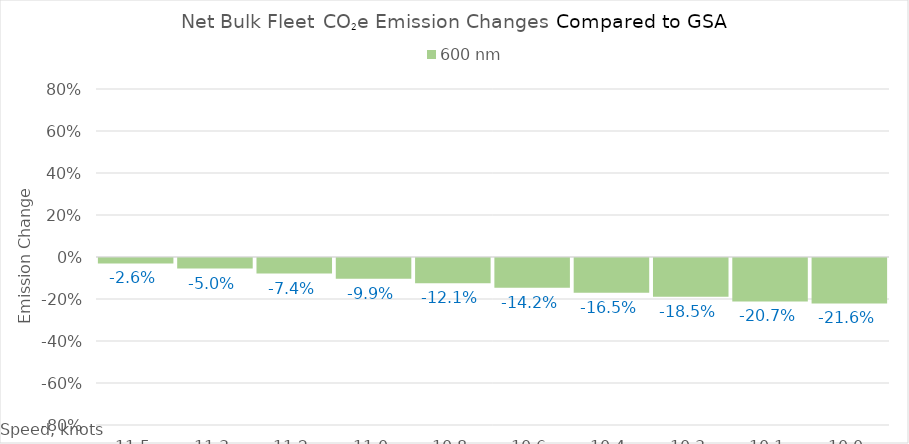
| Category | 600 |
|---|---|
| 11.52 | -0.026 |
| 11.34 | -0.05 |
| 11.16 | -0.074 |
| 10.98 | -0.099 |
| 10.8 | -0.121 |
| 10.620000000000001 | -0.142 |
| 10.440000000000001 | -0.165 |
| 10.260000000000002 | -0.185 |
| 10.080000000000002 | -0.207 |
| 10.0 | -0.216 |